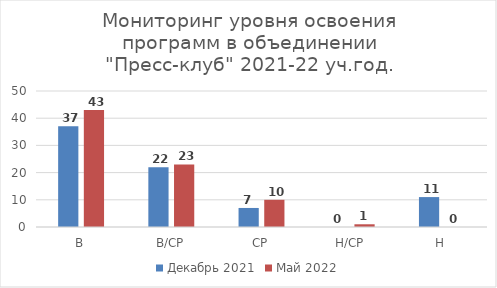
| Category | Декабрь 2021 | Май 2022 |
|---|---|---|
| В | 37 | 43 |
| В/СР | 22 | 23 |
| СР | 7 | 10 |
| Н/СР | 0 | 1 |
| Н | 11 | 0 |